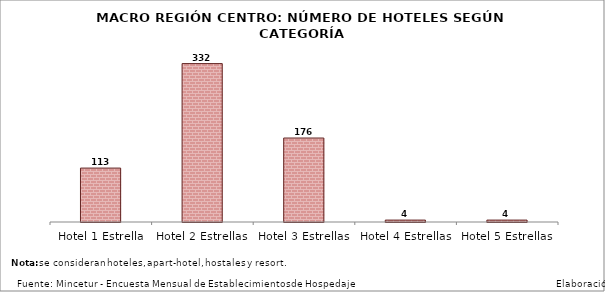
| Category | Series 0 |
|---|---|
| Hotel 1 Estrella | 113 |
| Hotel 2 Estrellas | 332 |
| Hotel 3 Estrellas | 176 |
| Hotel 4 Estrellas | 4 |
| Hotel 5 Estrellas | 4 |